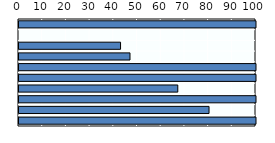
| Category | Payment rate (%) |
|---|---|
| Viet Nam | 100 |
| OECD average | 0 |
| Australia | 42.852 |
| New Zealand | 46.834 |
| Singapore | 100 |
| China | 100 |
| Japan | 67 |
| Indonesia | 100 |
| Korea | 80.183 |
| Thailand | 100 |